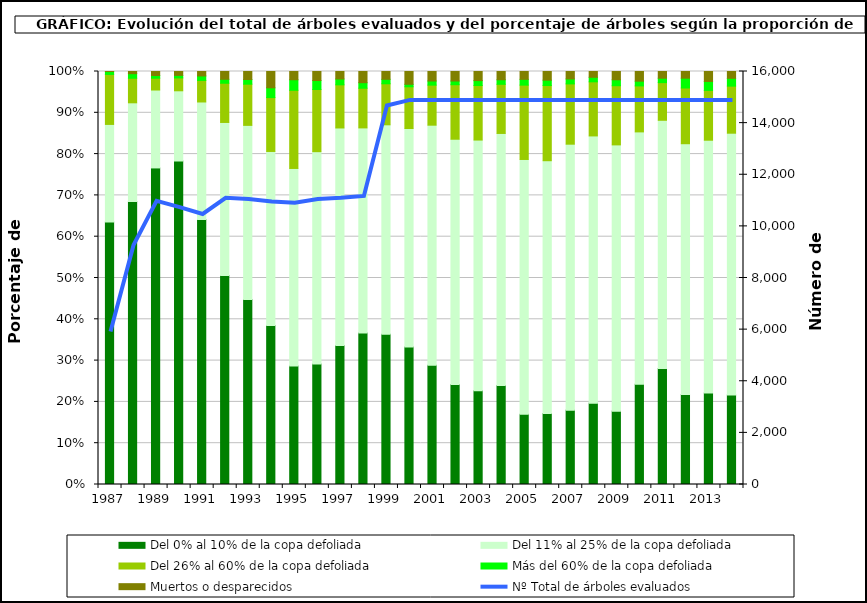
| Category | Del 0% al 10% de la copa defoliada | Del 11% al 25% de la copa defoliada | Del 26% al 60% de la copa defoliada | Más del 60% de la copa defoliada | Muertos o desparecidos |
|---|---|---|---|---|---|
| 1987.0 | 63.541 | 23.646 | 12.102 | 0.711 | 0 |
| 1988.0 | 68.521 | 23.898 | 5.95 | 1.102 | 0.529 |
| 1989.0 | 76.65 | 18.864 | 2.863 | 0.656 | 0.966 |
| 1990.0 | 78.328 | 17.002 | 3.113 | 0.615 | 0.941 |
| 1991.0 | 64.194 | 28.427 | 5.219 | 1.08 | 1.08 |
| 1992.0 | 50.622 | 37.04 | 9.497 | 0.956 | 1.885 |
| 1993.0 | 44.801 | 42.156 | 9.973 | 1.132 | 1.938 |
| 1994.0 | 38.487 | 42.151 | 13.048 | 2.367 | 3.947 |
| 1995.0 | 28.708 | 47.816 | 18.924 | 2.551 | 2.001 |
| 1996.0 | 29.149 | 51.44 | 15.054 | 2.174 | 2.183 |
| 1997.0 | 33.649 | 52.679 | 10.444 | 1.416 | 1.813 |
| 1998.0 | 36.658 | 49.686 | 9.606 | 1.344 | 2.706 |
| 1999.0 | 36.402 | 50.689 | 9.936 | 1.084 | 1.889 |
| 2000.0 | 33.3 | 52.9 | 10.1 | 0.6 | 3.1 |
| 2001.0 | 28.9 | 58.1 | 9.7 | 1 | 2.3 |
| 2002.0 | 24.2 | 59.4 | 13.2 | 0.9 | 2.3 |
| 2003.0 | 22.7 | 60.7 | 13.2 | 1.2 | 2.2 |
| 2004.0 | 24 | 61 | 11.9 | 1.1 | 2 |
| 2005.0 | 17 | 61.7 | 18 | 1.4 | 1.9 |
| 2006.0 | 17.2 | 61.2 | 18.2 | 1.3 | 2.1 |
| 2007.0 | 18 | 64.4 | 14.6 | 1.2 | 1.8 |
| 2008.0 | 19.7 | 64.7 | 13.1 | 1.1 | 1.4 |
| 2009.0 | 17.762 | 64.469 | 14.328 | 1.431 | 2.009 |
| 2010.0 | 24.301 | 61.075 | 11.136 | 1.142 | 2.345 |
| 2011.0 | 28.078 | 60.108 | 9.12 | 1.069 | 1.626 |
| 2012.0 | 21.815 | 60.699 | 13.495 | 2.372 | 1.62 |
| 2013.0 | 22.171 | 61.19 | 12.07 | 2.157 | 2.413 |
| 2014.0 | 21.694 | 63.427 | 11.405 | 1.9 | 1.647 |